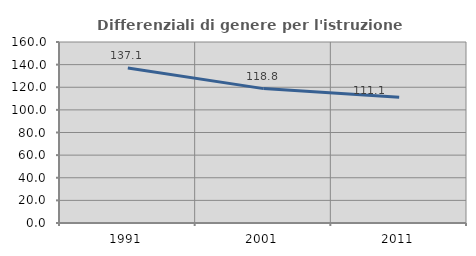
| Category | Differenziali di genere per l'istruzione superiore |
|---|---|
| 1991.0 | 137.099 |
| 2001.0 | 118.799 |
| 2011.0 | 111.111 |